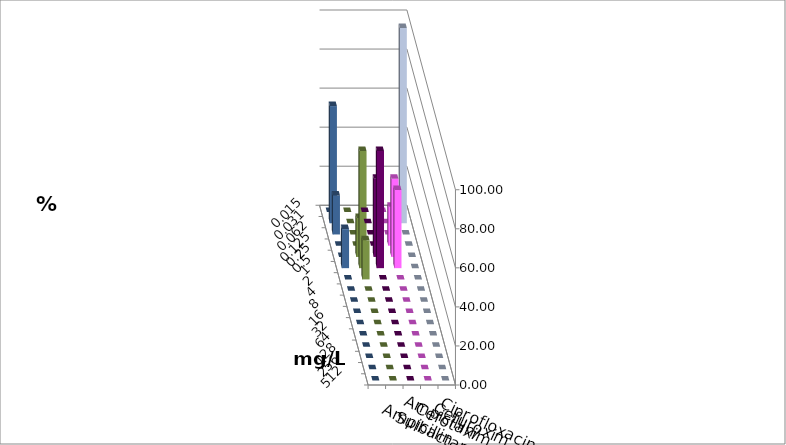
| Category | Ampicillin | Ampicillin/ Sulbactam | Cefotaxim | Cefuroxim | Ciprofloxacin |
|---|---|---|---|---|---|
| 0.015 | 0 | 0 | 0 | 0 | 0 |
| 0.031 | 0 | 0 | 100 | 0 | 60 |
| 0.062 | 0 | 0 | 0 | 0 | 20 |
| 0.125 | 0 | 20 | 0 | 0 | 0 |
| 0.25 | 40 | 40 | 0 | 20 | 0 |
| 0.5 | 60 | 40 | 0 | 60 | 20 |
| 1.0 | 0 | 0 | 0 | 20 | 0 |
| 2.0 | 0 | 0 | 0 | 0 | 0 |
| 4.0 | 0 | 0 | 0 | 0 | 0 |
| 8.0 | 0 | 0 | 0 | 0 | 0 |
| 16.0 | 0 | 0 | 0 | 0 | 0 |
| 32.0 | 0 | 0 | 0 | 0 | 0 |
| 64.0 | 0 | 0 | 0 | 0 | 0 |
| 128.0 | 0 | 0 | 0 | 0 | 0 |
| 256.0 | 0 | 0 | 0 | 0 | 0 |
| 512.0 | 0 | 0 | 0 | 0 | 0 |